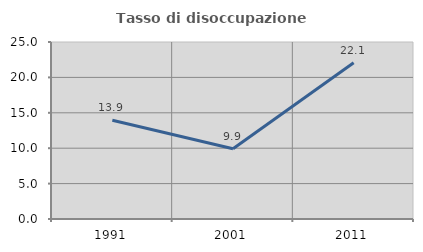
| Category | Tasso di disoccupazione giovanile  |
|---|---|
| 1991.0 | 13.938 |
| 2001.0 | 9.928 |
| 2011.0 | 22.069 |